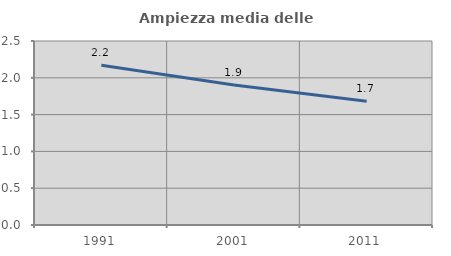
| Category | Ampiezza media delle famiglie |
|---|---|
| 1991.0 | 2.17 |
| 2001.0 | 1.901 |
| 2011.0 | 1.68 |